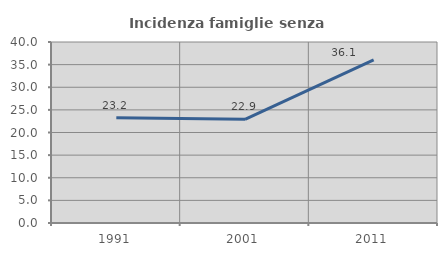
| Category | Incidenza famiglie senza nuclei |
|---|---|
| 1991.0 | 23.239 |
| 2001.0 | 22.902 |
| 2011.0 | 36.072 |